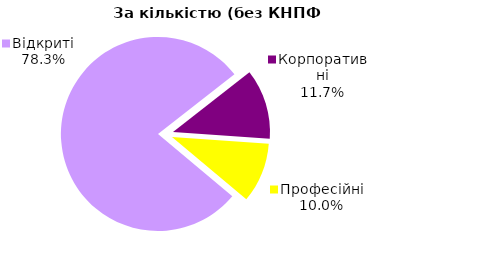
| Category | Series 0 |
|---|---|
| Відкриті | 47 |
| Корпоративні | 7 |
| Професійні | 6 |